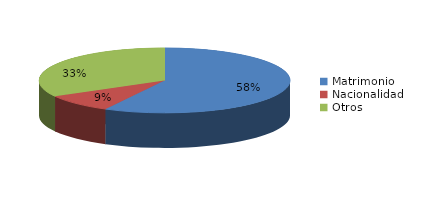
| Category | Series 0 |
|---|---|
| Matrimonio | 1737 |
| Nacionalidad | 272 |
| Otros | 998 |